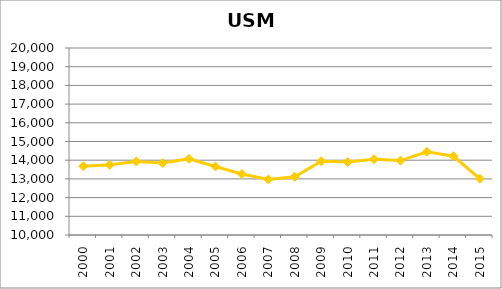
| Category | Series 0 |
|---|---|
| 2000.0 | 13680.533 |
| 2001.0 | 13752.717 |
| 2002.0 | 13934.942 |
| 2003.0 | 13848.042 |
| 2004.0 | 14071.642 |
| 2005.0 | 13665.942 |
| 2006.0 | 13261.692 |
| 2007.0 | 12974.175 |
| 2008.0 | 13114.825 |
| 2009.0 | 13948.467 |
| 2010.0 | 13902.467 |
| 2011.0 | 14051.35 |
| 2012.0 | 13978.633 |
| 2013.0 | 14447.608 |
| 2014.0 | 14212.767 |
| 2015.0 | 13008.858 |